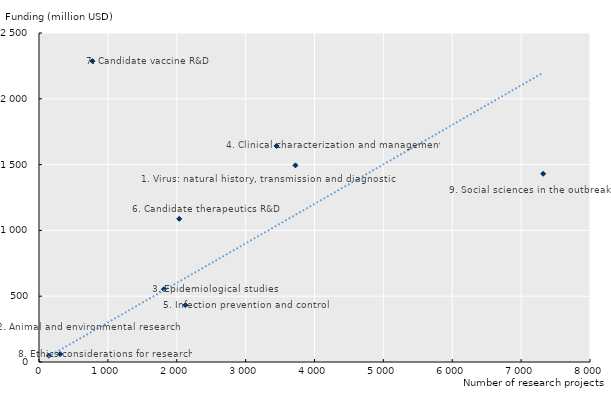
| Category | Series 0 |
|---|---|
| 3723.0 | 1494 |
| 143.0 | 48 |
| 1813.0 | 553 |
| 3449.0 | 1642 |
| 2125.0 | 432 |
| 2036.0 | 1088 |
| 776.0 | 2286 |
| 307.0 | 60 |
| 7320.0 | 1430 |